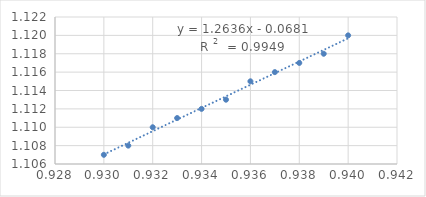
| Category | Series 0 |
|---|---|
| 0.93 | 1.107 |
| 0.931 | 1.108 |
| 0.932 | 1.11 |
| 0.933 | 1.111 |
| 0.934 | 1.112 |
| 0.935 | 1.113 |
| 0.936 | 1.115 |
| 0.937 | 1.116 |
| 0.938 | 1.117 |
| 0.939 | 1.118 |
| 0.94 | 1.12 |